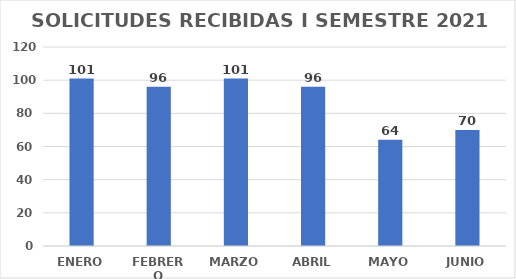
| Category | No. Solicitudes |
|---|---|
| ENERO | 101 |
| FEBRERO | 96 |
| MARZO | 101 |
| ABRIL | 96 |
| MAYO | 64 |
| JUNIO | 70 |